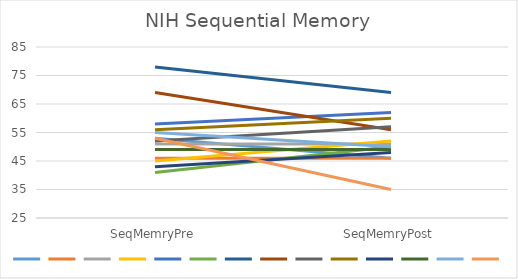
| Category | Series 0 | Series 1 | Series 2 | Series 3 | Series 4 | Series 5 | Series 6 | Series 7 | Series 8 | Series 9 | Series 10 | Series 11 | Series 12 | Series 13 |
|---|---|---|---|---|---|---|---|---|---|---|---|---|---|---|
| SeqMemryPre | 53 | 46 | 51 | 45 | 58 | 41 | 78 | 69 | 52 | 56 | 43 | 49 | 55 | 53 |
| SeqMemryPost | 46 | 46 | 51 | 52 | 62 | 50 | 69 | 56 | 57 | 60 | 48 | 49 | 50 | 35 |